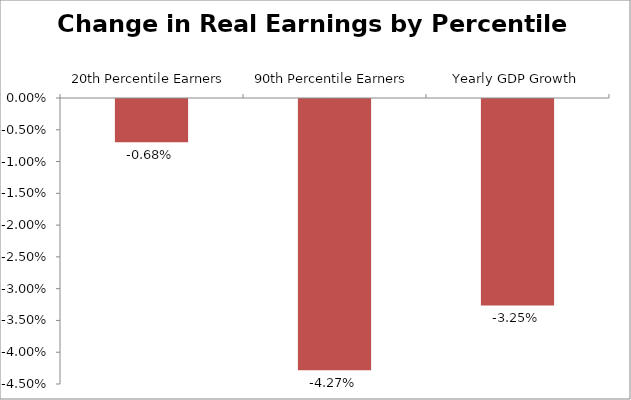
| Category | Series 0 |
|---|---|
| 20th Percentile Earners | -0.007 |
| 90th Percentile Earners | -0.043 |
| Yearly GDP Growth | -0.032 |